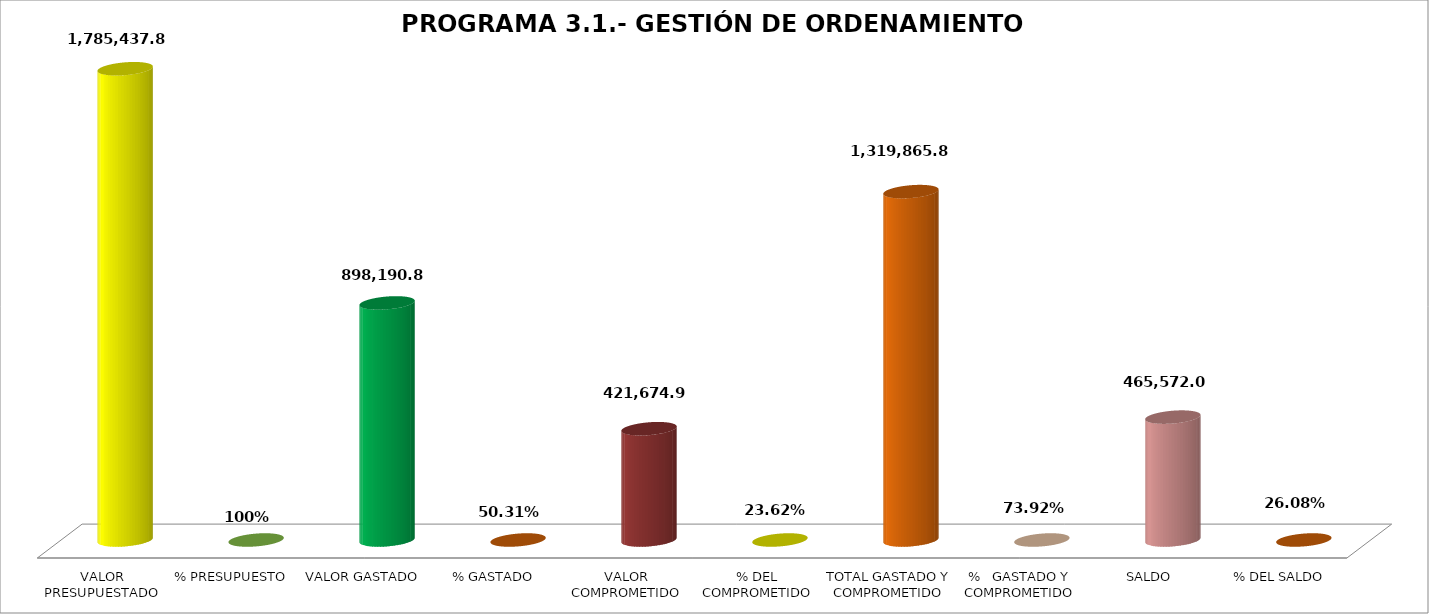
| Category | PROGRAMA 3.1.- GESTIÓN DE ORDENAMIENTO TERRITORIAL |
|---|---|
| VALOR PRESUPUESTADO | 1785437.83 |
| % PRESUPUESTO | 1 |
| VALOR GASTADO | 898190.87 |
| % GASTADO | 0.503 |
| VALOR COMPROMETIDO | 421674.93 |
| % DEL COMPROMETIDO | 0.236 |
| TOTAL GASTADO Y COMPROMETIDO | 1319865.8 |
| %   GASTADO Y COMPROMETIDO | 0.739 |
| SALDO | 465572.03 |
| % DEL SALDO | 0.261 |